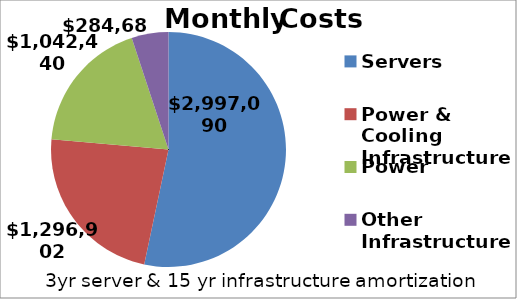
| Category | Series 0 |
|---|---|
| Servers | 2997089.71 |
| Power & Cooling Infrastructure | 1296901.548 |
| Power | 1042440 |
| Other Infrastructure | 284685.706 |